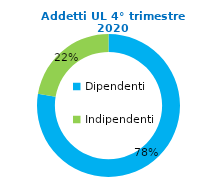
| Category | Series 0 |
|---|---|
| Dipendenti | 77294 |
| Indipendenti | 22310 |